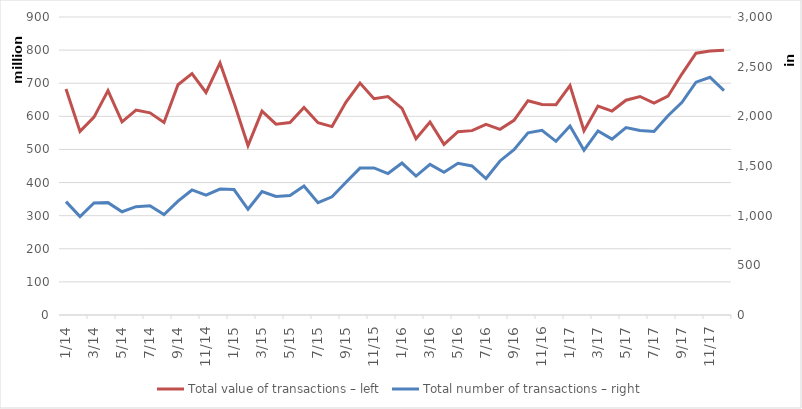
| Category | Total |
|---|---|
| 2014-01-01 | 682486357 |
| 2014-02-01 | 554509462 |
| 2014-03-01 | 597655513 |
| 2014-04-01 | 677759015 |
| 2014-05-01 | 583455556 |
| 2014-06-01 | 619050411 |
| 2014-07-01 | 610679964 |
| 2014-08-01 | 581652263 |
| 2014-09-01 | 695420615 |
| 2014-10-01 | 729293580 |
| 2014-11-01 | 672028830 |
| 2014-12-01 | 761376397 |
| 2015-01-01 | 641299671 |
| 2015-02-01 | 511688951 |
| 2015-03-01 | 615585263 |
| 2015-04-01 | 576421064 |
| 2015-05-01 | 581511130 |
| 2015-06-01 | 627062614 |
| 2015-07-01 | 580709895 |
| 2015-08-01 | 568948581 |
| 2015-09-01 | 643329372 |
| 2015-10-01 | 700607232 |
| 2015-11-01 | 653154508 |
| 2015-12-01 | 659735271 |
| 2016-01-01 | 623719958 |
| 2016-02-01 | 532385709 |
| 2016-03-01 | 582836319 |
| 2016-04-01 | 515291890 |
| 2016-05-01 | 553441839 |
| 2016-06-01 | 556836864 |
| 2016-07-01 | 575613675 |
| 2016-08-01 | 560806298 |
| 2016-09-01 | 588038057 |
| 2016-10-01 | 647245989 |
| 2016-11-01 | 635952032 |
| 2016-12-01 | 635268256 |
| 2017-01-01 | 692948345 |
| 2017-02-01 | 556418837 |
| 2017-03-01 | 631091280 |
| 2017-04-01 | 615993630 |
| 2017-05-01 | 648629380 |
| 2017-06-01 | 659859183 |
| 2017-07-01 | 640128686 |
| 2017-08-01 | 660847615 |
| 2017-09-01 | 728459665 |
| 2017-10-01 | 790689068 |
| 2017-11-01 | 797055016 |
| 2017-12-01 | 799872308 |